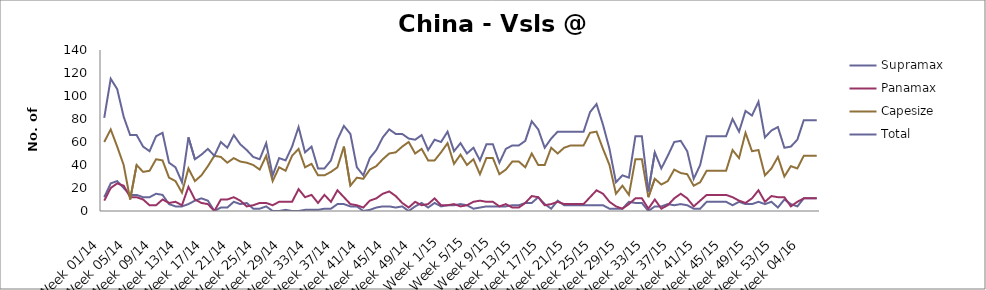
| Category | Supramax | Panamax | Capesize | Total |
|---|---|---|---|---|
| Week 01/14 | 12 | 9 | 60 | 81 |
| Week 02/14 | 24 | 20 | 71 | 115 |
| Week 03/14 | 26 | 24 | 56 | 106 |
| Week 04/14 | 20 | 22 | 40 | 82 |
| Week 05/14 | 14 | 12 | 10 | 66 |
| Week 06/14 | 14 | 12 | 40 | 66 |
| Week 07/14 | 12 | 10 | 34 | 56 |
| Week 08/14 | 12 | 5 | 35 | 52 |
| Week 09/14 | 15 | 5 | 45 | 65 |
| Week 10/14 | 14 | 10 | 44 | 68 |
| Week 11/14 | 6 | 7 | 29 | 42 |
| Week 12/14 | 4 | 8 | 26 | 38 |
| Week 13/14 | 4 | 5 | 16 | 25 |
| Week 14/14 | 6 | 21 | 37 | 64 |
| Week 15/14 | 9 | 10 | 26 | 45 |
| Week 16/14 | 11 | 7 | 31 | 49 |
| Week 17/14 | 9 | 6 | 39 | 54 |
| Week 18/14 | 0 | 0 | 48 | 48 |
| Week 19/14 | 3 | 10 | 47 | 60 |
| Week 20/14 | 3 | 10 | 42 | 55 |
| Week 21/14 | 8 | 12 | 46 | 66 |
| Week 22/14 | 6 | 9 | 43 | 58 |
| Week 23/14 | 7 | 4 | 42 | 53 |
| Week 24/14 | 2 | 5 | 40 | 47 |
| Week 25/14 | 2 | 7 | 36 | 45 |
| Week 26/14 | 4 | 7 | 48 | 59 |
| Week 27/14 | 0 | 5 | 26 | 31 |
| Week 28/14 | 0 | 8 | 38 | 46 |
| Week 29/14 | 1 | 8 | 35 | 44 |
| Week 30/14 | 0 | 8 | 48 | 56 |
| Week 31/14 | 0 | 19 | 54 | 73 |
| Week 32/14 | 1 | 12 | 38 | 51 |
| Week 33/14 | 1 | 14 | 41 | 56 |
| Week 34/14 | 1 | 7 | 31 | 37 |
| Week 35/14 | 2 | 14 | 31 | 37 |
| Week 36/14 | 2 | 8 | 34 | 44 |
| Week 37/14 | 6 | 18 | 38 | 62 |
| Week 38/14 | 6 | 12 | 56 | 74 |
| Week 39/14 | 4 | 6 | 22 | 67 |
| Week 40/14 | 4 | 5 | 29 | 38 |
| Week 41/14 | 0 | 3 | 28 | 31 |
| Week 42/14 | 1 | 9 | 36 | 46 |
| Week 43/14 | 3 | 11 | 39 | 53 |
| Week 44/14 | 4 | 15 | 45 | 64 |
| Week 45/14 | 4 | 17 | 50 | 71 |
| Week 46/14 | 3 | 13 | 51 | 67 |
| Week 47/14 | 4 | 7 | 56 | 67 |
| Week 48/14 | 0 | 3 | 60 | 63 |
| Week 49/14 | 4 | 8 | 50 | 62 |
| Week 50/14 | 7 | 5 | 54 | 66 |
| Week 51/14 | 3 | 6 | 44 | 53 |
| Week 52/14 | 7 | 11 | 44 | 62 |
| Week 1/15 | 4 | 5 | 51 | 60 |
| Week 2/15 | 5 | 5 | 59 | 69 |
| Week 3/15 | 5 | 6 | 41 | 52 |
| Week 4/15 | 6 | 4 | 49 | 59 |
| Week 5/15 | 5 | 5 | 40 | 50 |
| Week 6/15 | 2 | 8 | 45 | 55 |
| Week 7/15 | 3 | 9 | 32 | 44 |
| Week 8/15 | 4 | 8 | 46 | 58 |
| Week 9/15 | 4 | 8 | 46 | 58 |
| Week 10/15 | 4 | 4 | 32 | 42 |
| Week 11/15 | 4 | 6 | 36 | 54 |
| Week 12/15 | 5 | 3 | 43 | 57 |
| Week 13/15 | 5 | 3 | 43 | 57 |
| Week 14/15 | 7 | 7 | 38 | 61 |
| Week 15/15 | 7 | 13 | 50 | 78 |
| Week 16/15 | 12 | 12 | 40 | 71 |
| Week 17/15 | 6 | 5 | 40 | 55 |
| Week 18/15 | 2 | 6 | 55 | 63 |
| Week 19/15 | 9 | 8 | 50 | 69 |
| Week 20/15 | 5 | 6 | 55 | 69 |
| Week 21/15 | 5 | 6 | 57 | 69 |
| Week 22/15 | 5 | 6 | 57 | 69 |
| Week 23/15 | 5 | 6 | 57 | 69 |
| Week 24/15 | 5 | 12 | 68 | 86 |
| Week 25/15 | 5 | 18 | 69 | 93 |
| Week 26/15 | 5 | 15 | 54 | 75 |
| Week 27/15 | 2 | 8 | 40 | 54 |
| Week 28/15 | 2 | 4 | 15 | 25 |
| Week 29/15 | 2 | 2 | 22 | 31 |
| Week 30/15 | 8 | 6 | 14 | 29 |
| Week 31/15 | 7 | 11 | 45 | 65 |
| Week 32/15 | 7 | 11 | 45 | 65 |
| Week 33/15 | 0 | 2 | 12 | 17 |
| Week 34/15 | 4 | 10 | 28 | 51 |
| Week 35/15 | 4 | 2 | 23 | 37 |
| Week 36/15 | 6 | 5 | 26 | 48 |
| Week 37/15 | 5 | 11 | 36 | 60 |
| Week 38/15 | 6 | 15 | 33 | 61 |
| Week 39/15 | 5 | 11 | 32 | 52 |
| Week 40/15 | 2 | 4 | 22 | 28 |
| Week 41/15 | 2 | 9 | 25 | 40 |
| Week 42/15 | 8 | 14 | 35 | 65 |
| Week 43/15 | 8 | 14 | 35 | 65 |
| Week 44/15 | 8 | 14 | 35 | 65 |
| Week 45/15 | 8 | 14 | 35 | 65 |
| Week 46/15 | 5 | 12 | 53 | 80 |
| Week 47/15 | 8 | 9 | 46 | 69 |
| Week 48/15 | 6 | 7 | 68 | 87 |
| Week 49/15 | 6 | 11 | 52 | 83 |
| Week 50/15 | 8 | 18 | 53 | 95 |
| Week 51/15 | 6 | 8 | 31 | 64 |
| Week 52/15 | 8 | 13 | 37 | 70 |
| Week 53/15 | 3 | 12 | 47 | 73 |
| Week 01/16 | 10 | 12 | 30 | 55 |
| Week 02/16 | 6 | 4 | 39 | 56 |
| Week 03/16 | 4 | 8 | 37 | 62 |
| Week 04/16 | 11 | 11 | 48 | 79 |
| Week 05/16 | 11 | 11 | 48 | 79 |
| Week 06/16 | 11 | 11 | 48 | 79 |